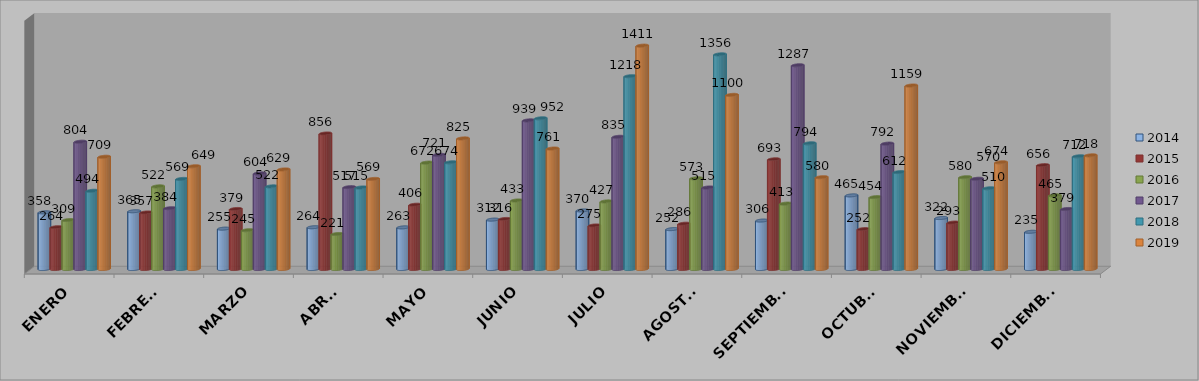
| Category | 2014 | 2015 | 2016 | 2017 | 2018 | 2019 |
|---|---|---|---|---|---|---|
| ENERO | 358 | 264 | 309 | 804 | 494 | 709 |
| FEBRERO | 365 | 357 | 522 | 384 | 569 | 649 |
| MARZO | 255 | 379 | 245 | 604 | 522 | 629 |
| ABRIL | 264 | 856 | 221 | 517 | 515 | 569 |
| MAYO | 263 | 406 | 672 | 721 | 674 | 825 |
| JUNIO | 312 | 316 | 433 | 939 | 952 | 761 |
| JULIO | 370 | 275 | 427 | 835 | 1218 | 1411 |
| AGOSTO | 252 | 286 | 573 | 515 | 1356 | 1100 |
| SEPTIEMBRE | 306 | 693 | 413 | 1287 | 794 | 580 |
| OCTUBRE | 465 | 252 | 454 | 792 | 612 | 1159 |
| NOVIEMBRE | 322 | 293 | 580 | 570 | 510 | 674 |
| DICIEMBRE | 235 | 656 | 465 | 379 | 712 | 718 |